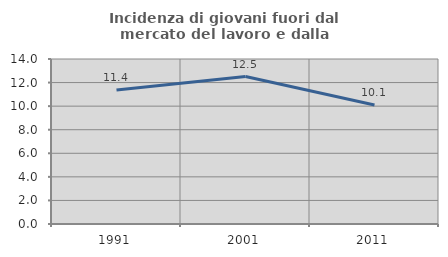
| Category | Incidenza di giovani fuori dal mercato del lavoro e dalla formazione  |
|---|---|
| 1991.0 | 11.367 |
| 2001.0 | 12.515 |
| 2011.0 | 10.092 |